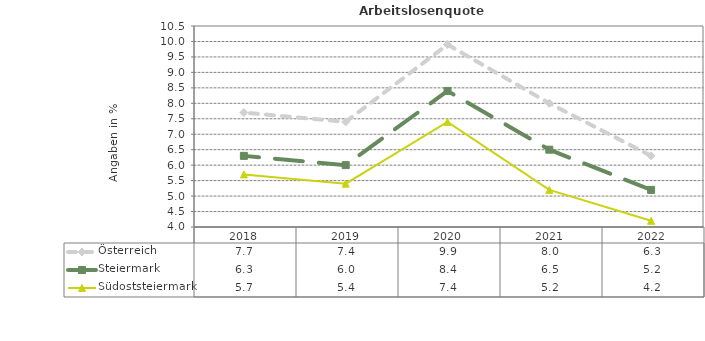
| Category | Österreich | Steiermark | Südoststeiermark |
|---|---|---|---|
| 2022.0 | 6.3 | 5.2 | 4.2 |
| 2021.0 | 8 | 6.5 | 5.2 |
| 2020.0 | 9.9 | 8.4 | 7.4 |
| 2019.0 | 7.4 | 6 | 5.4 |
| 2018.0 | 7.7 | 6.3 | 5.7 |